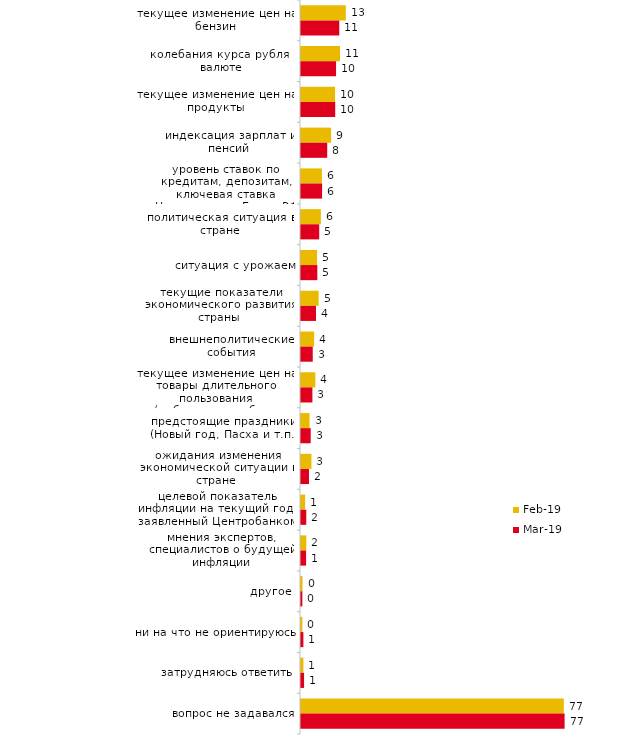
| Category | фев.19 | мар.19 |
|---|---|---|
| текущее изменение цен на бензин | 13.1 | 11.188 |
| колебания курса рубля к валюте | 11.4 | 10.244 |
| текущее изменение цен на продукты | 9.95 | 9.995 |
| индексация зарплат и пенсий | 8.8 | 7.658 |
| уровень ставок по кредитам, депозитам, ключевая ставка Центрального Банка РФ | 6.1 | 6.166 |
| политическая ситуация в стране | 5.8 | 5.321 |
| ситуация с урожаем | 4.7 | 4.774 |
| текущие показатели экономического развития страны | 5.15 | 4.376 |
| внешнеполитические события | 3.85 | 3.431 |
| текущее изменение цен на товары длительного пользования (мебель, автомобиль, бытовая техника и т.п.) | 4.2 | 3.332 |
| предстоящие праздники (Новый год, Пасха и т.п.) | 2.5 | 2.834 |
| ожидания изменения экономической ситуации в стране | 3.05 | 2.337 |
| целевой показатель инфляции на текущий год, заявленный Центробанком | 1.2 | 1.542 |
| мнения экспертов, специалистов о будущей инфляции | 1.55 | 1.492 |
| другое | 0.45 | 0.398 |
| ни на что не ориентируюсь | 0.4 | 0.696 |
| затрудняюсь ответить | 0.7 | 0.895 |
| вопрос не задавался | 76.8 | 77.026 |